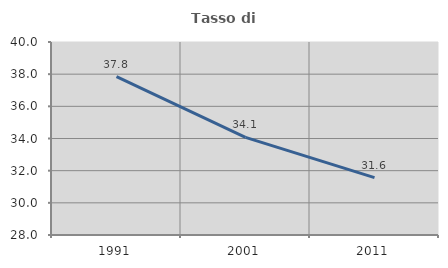
| Category | Tasso di occupazione   |
|---|---|
| 1991.0 | 37.848 |
| 2001.0 | 34.074 |
| 2011.0 | 31.563 |